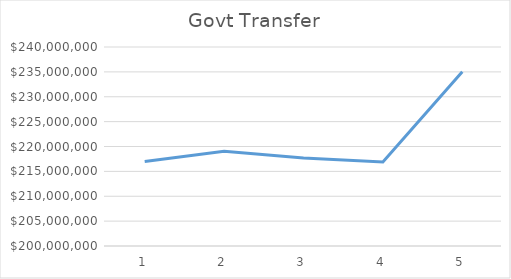
| Category | Series 0 |
|---|---|
| 0 | 216995000 |
| 1 | 219037000 |
| 2 | 217687000 |
| 3 | 216891000 |
| 4 | 235041000 |